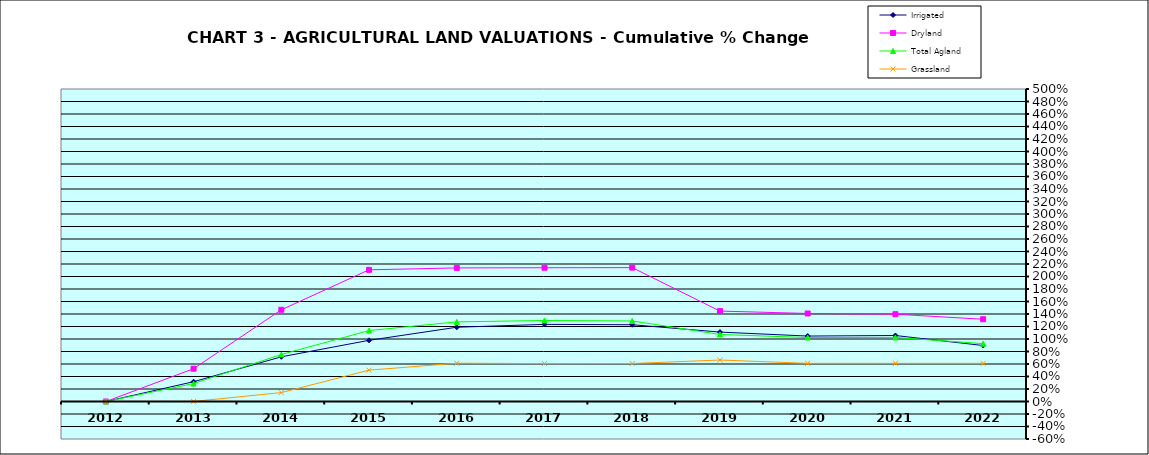
| Category | Irrigated | Dryland | Total Agland | Grassland |
|---|---|---|---|---|
| 2012.0 | 0 | 0 | 0 | 0 |
| 2013.0 | 0.317 | 0.525 | 0.287 | 0.002 |
| 2014.0 | 0.715 | 1.467 | 0.752 | 0.142 |
| 2015.0 | 0.979 | 2.107 | 1.135 | 0.502 |
| 2016.0 | 1.188 | 2.137 | 1.274 | 0.612 |
| 2017.0 | 1.234 | 2.14 | 1.296 | 0.607 |
| 2018.0 | 1.228 | 2.142 | 1.288 | 0.608 |
| 2019.0 | 1.111 | 1.447 | 1.073 | 0.664 |
| 2020.0 | 1.047 | 1.408 | 1.023 | 0.611 |
| 2021.0 | 1.056 | 1.397 | 1.025 | 0.61 |
| 2022.0 | 0.896 | 1.316 | 0.925 | 0.61 |